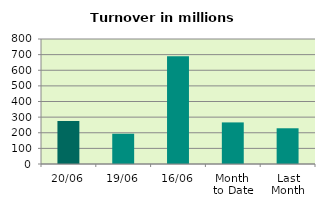
| Category | Series 0 |
|---|---|
| 20/06 | 275.674 |
| 19/06 | 193.648 |
| 16/06 | 689.072 |
| Month 
to Date | 266.146 |
| Last
Month | 228.645 |